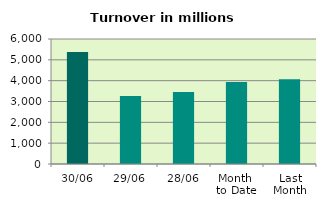
| Category | Series 0 |
|---|---|
| 30/06 | 5370.304 |
| 29/06 | 3258.87 |
| 28/06 | 3451.482 |
| Month 
to Date | 3940.311 |
| Last
Month | 4067.502 |